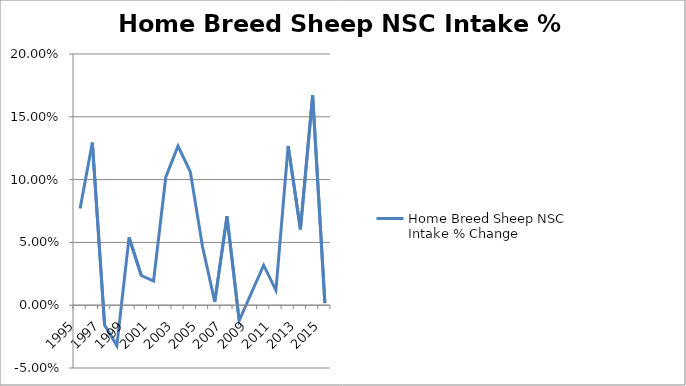
| Category | Home Breed Sheep NSC Intake % Change |
|---|---|
| 1995.0 | 0.077 |
| 1996.0 | 0.129 |
| 1997.0 | -0.016 |
| 1998.0 | -0.032 |
| 1999.0 | 0.054 |
| 2000.0 | 0.024 |
| 2001.0 | 0.019 |
| 2002.0 | 0.102 |
| 2003.0 | 0.127 |
| 2004.0 | 0.106 |
| 2005.0 | 0.047 |
| 2006.0 | 0.003 |
| 2007.0 | 0.071 |
| 2008.0 | -0.012 |
| 2009.0 | 0.01 |
| 2010.0 | 0.032 |
| 2011.0 | 0.012 |
| 2012.0 | 0.127 |
| 2013.0 | 0.06 |
| 2014.0 | 0.167 |
| 2015.0 | 0.002 |